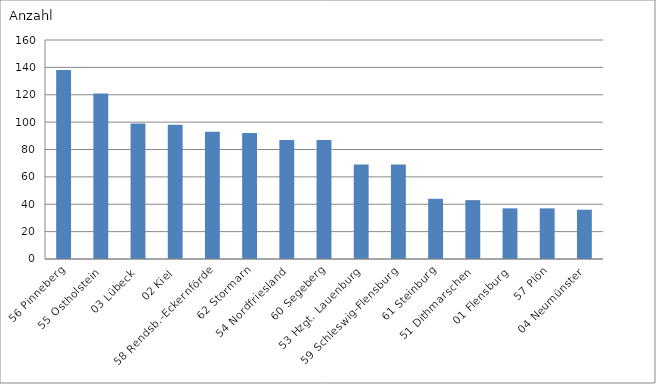
| Category | 56 Pinneberg |
|---|---|
| 56 Pinneberg | 138 |
| 55 Ostholstein | 121 |
| 03 Lübeck | 99 |
| 02 Kiel | 98 |
| 58 Rendsb.-Eckernförde | 93 |
| 62 Stormarn | 92 |
| 54 Nordfriesland | 87 |
| 60 Segeberg | 87 |
| 53 Hzgt. Lauenburg | 69 |
| 59 Schleswig-Flensburg | 69 |
| 61 Steinburg | 44 |
| 51 Dithmarschen | 43 |
| 01 Flensburg | 37 |
| 57 Plön | 37 |
| 04 Neumünster | 36 |